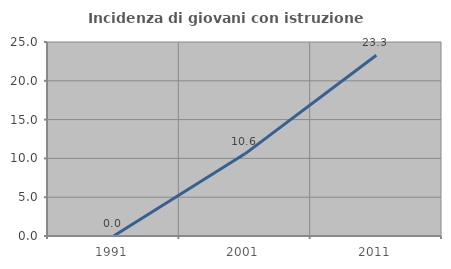
| Category | Incidenza di giovani con istruzione universitaria |
|---|---|
| 1991.0 | 0 |
| 2001.0 | 10.588 |
| 2011.0 | 23.288 |